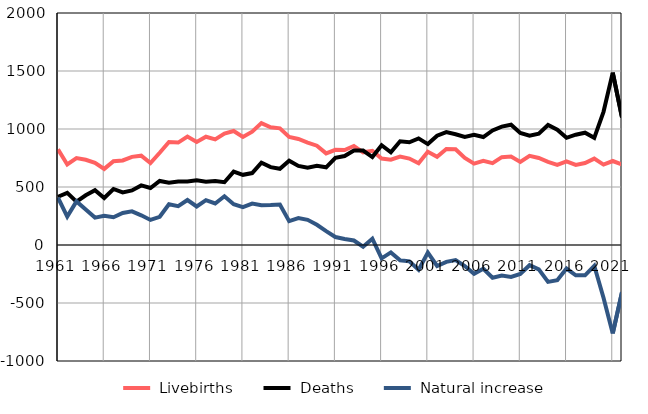
| Category |  Livebirths |  Deaths |  Natural increase |
|---|---|---|---|
| 1961.0 | 824 | 416 | 408 |
| 1962.0 | 694 | 449 | 245 |
| 1963.0 | 750 | 374 | 376 |
| 1964.0 | 735 | 429 | 306 |
| 1965.0 | 709 | 473 | 236 |
| 1966.0 | 656 | 405 | 251 |
| 1967.0 | 722 | 483 | 239 |
| 1968.0 | 729 | 453 | 276 |
| 1969.0 | 760 | 470 | 290 |
| 1970.0 | 770 | 514 | 256 |
| 1971.0 | 707 | 491 | 216 |
| 1972.0 | 795 | 552 | 243 |
| 1973.0 | 888 | 537 | 351 |
| 1974.0 | 883 | 548 | 335 |
| 1975.0 | 935 | 547 | 388 |
| 1976.0 | 889 | 557 | 332 |
| 1977.0 | 933 | 546 | 387 |
| 1978.0 | 910 | 552 | 358 |
| 1979.0 | 961 | 541 | 420 |
| 1980.0 | 983 | 632 | 351 |
| 1981.0 | 932 | 605 | 327 |
| 1982.0 | 977 | 620 | 357 |
| 1983.0 | 1051 | 709 | 342 |
| 1984.0 | 1015 | 671 | 344 |
| 1985.0 | 1006 | 657 | 349 |
| 1986.0 | 932 | 726 | 206 |
| 1987.0 | 914 | 682 | 232 |
| 1988.0 | 883 | 666 | 217 |
| 1989.0 | 856 | 682 | 174 |
| 1990.0 | 790 | 670 | 120 |
| 1991.0 | 821 | 752 | 69 |
| 1992.0 | 819 | 767 | 52 |
| 1993.0 | 854 | 815 | 39 |
| 1994.0 | 799 | 814 | -15 |
| 1995.0 | 812 | 758 | 54 |
| 1996.0 | 745 | 860 | -115 |
| 1997.0 | 735 | 799 | -64 |
| 1998.0 | 762 | 894 | -132 |
| 1999.0 | 745 | 886 | -141 |
| 2000.0 | 705 | 919 | -214 |
| 2001.0 | 804 | 870 | -66 |
| 2002.0 | 761 | 942 | -181 |
| 2003.0 | 828 | 973 | -145 |
| 2004.0 | 825 | 955 | -130 |
| 2005.0 | 751 | 932 | -181 |
| 2006.0 | 701 | 949 | -248 |
| 2007.0 | 726 | 931 | -205 |
| 2008.0 | 706 | 988 | -282 |
| 2009.0 | 757 | 1021 | -264 |
| 2010.0 | 762 | 1037 | -275 |
| 2011.0 | 716 | 966 | -250 |
| 2012.0 | 769 | 943 | -174 |
| 2013.0 | 750 | 960 | -210 |
| 2014.0 | 717 | 1035 | -318 |
| 2015.0 | 690 | 994 | -304 |
| 2016.0 | 721 | 924 | -203 |
| 2017.0 | 690 | 951 | -261 |
| 2018.0 | 707 | 968 | -261 |
| 2019.0 | 745 | 924 | -179 |
| 2020.0 | 693 | 1148 | -455 |
| 2021.0 | 724 | 1486 | -762 |
| 2022.0 | 693 | 1100 | -407 |